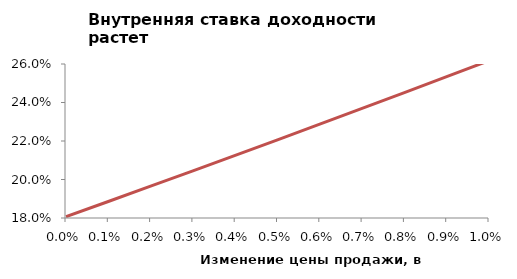
| Category | Series 1 |
|---|---|
| 0.0 | 0.181 |
| 0.001 | 0.189 |
| 0.002 | 0.197 |
| 0.003 | 0.205 |
| 0.004 | 0.213 |
| 0.005 | 0.221 |
| 0.006 | 0.229 |
| 0.007 | 0.237 |
| 0.008 | 0.245 |
| 0.009000000000000001 | 0.253 |
| 0.010000000000000002 | 0.262 |